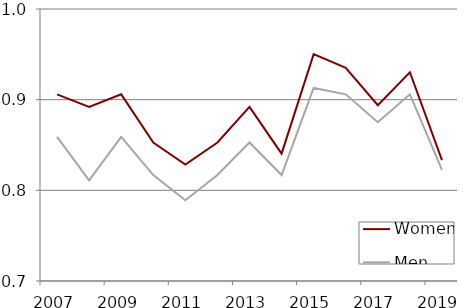
| Category | Women | Men |
|---|---|---|
| 2007.0 | 0.906 | 0.859 |
| 2008.0 | 0.892 | 0.811 |
| 2009.0 | 0.906 | 0.859 |
| 2010.0 | 0.853 | 0.817 |
| 2011.0 | 0.828 | 0.789 |
| 2012.0 | 0.853 | 0.817 |
| 2013.0 | 0.892 | 0.853 |
| 2014.0 | 0.84 | 0.817 |
| 2015.0 | 0.95 | 0.913 |
| 2016.0 | 0.935 | 0.906 |
| 2017.0 | 0.894 | 0.875 |
| 2018.0 | 0.93 | 0.906 |
| 2019.0 | 0.833 | 0.823 |